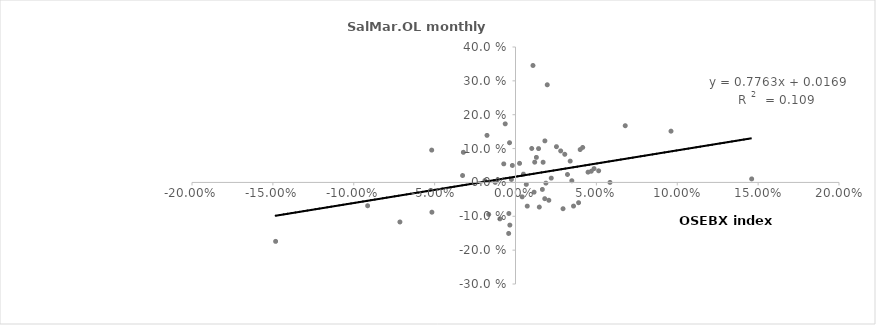
| Category | SalMar monthly return |
|---|---|
| -0.004111806066134295 | -0.092 |
| -0.0035059381544631984 | -0.126 |
| 0.014261826477115509 | 0.1 |
| 0.01817512038919843 | 0.123 |
| -0.016555465767100812 | -0.094 |
| 0.048569944994576 | 0.041 |
| 0.01004762378605591 | 0.1 |
| 0.05841571126289551 | 0 |
| 0.030469019113175417 | 0.083 |
| -0.012541043248661624 | 0 |
| 0.022112614515123138 | 0.013 |
| -0.004223711645055571 | -0.151 |
| 0.010801358666337645 | 0.345 |
| -0.017626910776756648 | 0.139 |
| 0.06784882348017954 | 0.167 |
| 0.01809386204234511 | -0.048 |
| 0.004134679867171859 | -0.043 |
| 0.01963283288839956 | 0.288 |
| 0.01147922548471509 | -0.029 |
| 0.03481896561157836 | 0.005 |
| -0.05179804796327186 | 0.096 |
| -0.03223702748285842 | 0.089 |
| -0.07145341288888038 | -0.117 |
| 0.04484273761471461 | 0.03 |
| 0.035878932458318386 | -0.07 |
| -0.0025079094943493275 | 0.009 |
| 0.020623082005012356 | -0.053 |
| -0.03271610821007253 | 0.02 |
| 0.014716728987135557 | -0.073 |
| -0.0063495251937272686 | 0.173 |
| 0.0025024593924892102 | 0.056 |
| 0.029386151756661854 | -0.078 |
| 0.01291451873443319 | 0.074 |
| 0.004899531271971945 | 0.025 |
| 0.032134743879863786 | 0.023 |
| -0.018938229397972312 | 0.005 |
| -0.09143037194040417 | -0.069 |
| -0.14830294548330708 | -0.174 |
| 0.09613505228080382 | 0.151 |
| 0.02794446648755272 | 0.093 |
| -0.0019454158177287571 | 0.05 |
| 0.03899551084086138 | -0.06 |
| 0.039976799195788094 | 0.097 |
| -0.003689201130167808 | 0.117 |
| -0.05167686762457752 | -0.088 |
| 0.1460122467257423 | 0.01 |
| 0.046840524185978116 | 0.033 |
| -0.007258896280694424 | 0.055 |
| 0.041545125662340456 | 0.103 |
| 0.05142639304121389 | 0.034 |
| 0.016612173704911515 | -0.021 |
| 0.033824177302600844 | 0.063 |
| 0.007278522104467589 | -0.07 |
| 0.011882733071141327 | 0.06 |
| 0.006682614351133954 | -0.006 |
| 0.018793863767806892 | -0.002 |
| 0.025324145005246854 | 0.106 |
| -0.009649733161318785 | -0.108 |
| 0.017066406205754715 | 0.06 |